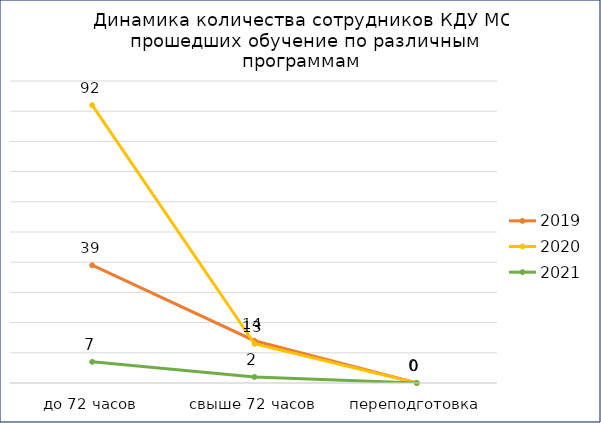
| Category | 2019 | 2020 | 2021 |
|---|---|---|---|
| до 72 часов | 39 | 92 | 7 |
| свыше 72 часов | 14 | 13 | 2 |
| переподготовка | 0 | 0 | 0 |